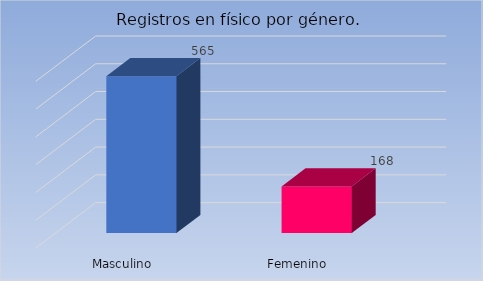
| Category | Cantidad |
|---|---|
| Masculino | 565 |
| Femenino | 168 |